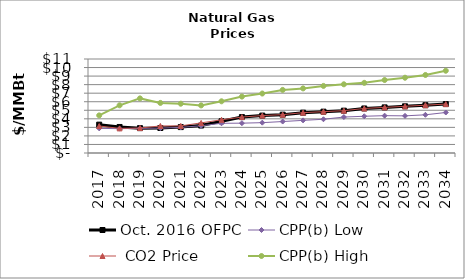
| Category | Oct. 2016 OFPC | CPP(b) Low |  CO2 Price | CPP(b) High |
|---|---|---|---|---|
| 2017.0 | 3.318 | 2.88 | 3.158 | 4.4 |
| 2018.0 | 3.044 | 2.848 | 2.883 | 5.58 |
| 2019.0 | 2.91 | 2.882 | 2.92 | 6.389 |
| 2020.0 | 2.925 | 2.91 | 3.166 | 5.86 |
| 2021.0 | 3.03 | 3.002 | 3.174 | 5.768 |
| 2022.0 | 3.214 | 3.185 | 3.522 | 5.572 |
| 2023.0 | 3.711 | 3.477 | 3.887 | 6.05 |
| 2024.0 | 4.204 | 3.491 | 4.204 | 6.602 |
| 2025.0 | 4.378 | 3.549 | 4.378 | 6.96 |
| 2026.0 | 4.488 | 3.682 | 4.488 | 7.382 |
| 2027.0 | 4.721 | 3.818 | 4.721 | 7.56 |
| 2028.0 | 4.838 | 3.949 | 4.838 | 7.85 |
| 2029.0 | 4.955 | 4.208 | 4.955 | 8.041 |
| 2030.0 | 5.212 | 4.3 | 5.212 | 8.209 |
| 2031.0 | 5.337 | 4.369 | 5.337 | 8.541 |
| 2032.0 | 5.463 | 4.348 | 5.463 | 8.81 |
| 2033.0 | 5.594 | 4.47 | 5.594 | 9.13 |
| 2034.0 | 5.723 | 4.74 | 5.723 | 9.628 |